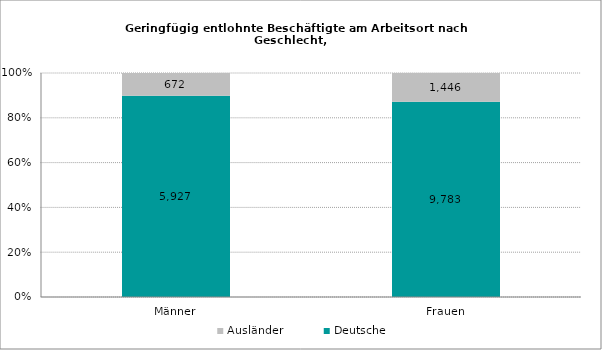
| Category | Deutsche | Ausländer |
|---|---|---|
| Männer | 5927 | 672 |
| Frauen | 9783 | 1446 |